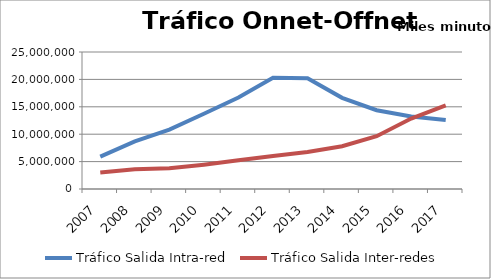
| Category | Tráfico Salida Intra-red | Tráfico Salida Inter-redes |
|---|---|---|
| 2007.0 | 5904083.795 | 3007133.407 |
| 2008.0 | 8700474.341 | 3605725.198 |
| 2009.0 | 10848127.978 | 3777186.553 |
| 2010.0 | 13731169.756 | 4442212.593 |
| 2011.0 | 16701623.385 | 5230021.942 |
| 2012.0 | 20281369.71 | 6022295.52 |
| 2013.0 | 20221752.311 | 6753941.544 |
| 2014.0 | 16638252.145 | 7814497.129 |
| 2015.0 | 14381121.54 | 9633316.484 |
| 2016.0 | 13225230.314 | 12856929.179 |
| 2017.0 | 12578132.761 | 15268259.097 |